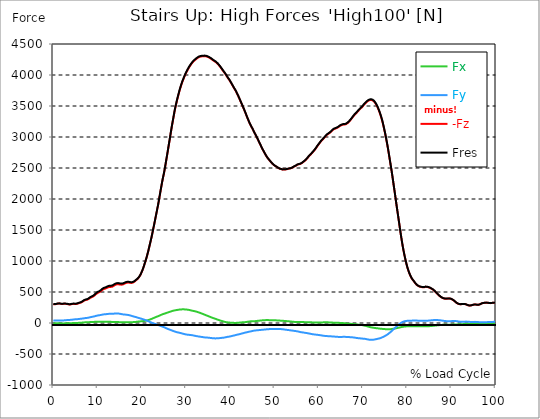
| Category |  Fx |  Fy |  -Fz |  Fres |
|---|---|---|---|---|
| 0.0 | -4.693 | 40.992 | 303.324 | 306.277 |
| 0.16678370786516855 | -5.185 | 40.376 | 303.131 | 306.014 |
| 0.3335674157303371 | -5.326 | 39.99 | 302.621 | 305.469 |
| 0.5003511235955057 | -5.291 | 39.744 | 302.076 | 304.889 |
| 0.6671348314606742 | -5.133 | 40.078 | 305.996 | 308.809 |
| 0.8339185393258427 | -5.221 | 39.779 | 309.547 | 312.324 |
| 1.0007022471910114 | -5.273 | 39.796 | 312.289 | 315.084 |
| 1.1674859550561796 | -5.15 | 40.376 | 313.871 | 316.719 |
| 1.3342696629213484 | -5.08 | 40.833 | 313.959 | 316.859 |
| 1.5010533707865168 | -5.309 | 40.957 | 312.166 | 315.084 |
| 1.6678370786516854 | -5.941 | 40.605 | 309.459 | 312.359 |
| 1.8346207865168538 | -6.644 | 40.025 | 306.611 | 309.476 |
| 2.001404494382023 | -6.75 | 40.007 | 306.277 | 309.16 |
| 2.1681882022471908 | -6.592 | 40.921 | 307.965 | 310.971 |
| 2.334971910112359 | -6.451 | 41.906 | 309.775 | 312.922 |
| 2.501755617977528 | -5.976 | 42.943 | 311.006 | 314.293 |
| 2.668539325842697 | -5.643 | 43.98 | 310.18 | 313.607 |
| 2.8353230337078656 | -5.115 | 45.281 | 309.037 | 312.658 |
| 3.0021067415730336 | -4.535 | 46.722 | 307.209 | 310.971 |
| 3.168890449438202 | -3.674 | 48.638 | 305.926 | 309.951 |
| 3.335674157303371 | -3.586 | 49.042 | 302.937 | 307.086 |
| 3.502457865168539 | -3.762 | 49.13 | 299.229 | 303.412 |
| 3.6692415730337076 | -3.797 | 49.499 | 296.82 | 301.092 |
| 3.8360252808988764 | -3.322 | 50.431 | 298.789 | 303.201 |
| 4.002808988764046 | -2.848 | 51.433 | 302.076 | 306.611 |
| 4.169592696629214 | -2.338 | 52.558 | 305.064 | 309.74 |
| 4.3363764044943816 | -1.775 | 54.07 | 307.262 | 312.148 |
| 4.50316011235955 | -1.213 | 55.599 | 308.316 | 313.449 |
| 4.669943820224718 | -0.791 | 57.603 | 307.613 | 313.133 |
| 4.836727528089888 | -0.387 | 58.904 | 306.365 | 312.183 |
| 5.003511235955056 | 0.018 | 59.818 | 305.434 | 311.463 |
| 5.170294943820225 | 0.422 | 60.837 | 306.506 | 312.693 |
| 5.337078651685394 | 0.826 | 61.277 | 308.439 | 314.68 |
| 5.5038623595505625 | 1.248 | 61.997 | 311.744 | 318.054 |
| 5.670646067415731 | 2.074 | 63.685 | 316.49 | 323.047 |
| 5.837429775280899 | 3.059 | 65.513 | 321.605 | 328.408 |
| 6.004213483146067 | 3.744 | 66.849 | 324.752 | 331.748 |
| 6.170997191011236 | 4.359 | 68.15 | 327.529 | 334.701 |
| 6.329002808988764 | 5.01 | 69.398 | 331.959 | 339.289 |
| 6.495786516853932 | 6.17 | 70.716 | 339.517 | 346.97 |
| 6.662570224719101 | 7.4 | 72.509 | 347.691 | 355.337 |
| 6.82935393258427 | 8.631 | 74.302 | 355.636 | 363.528 |
| 6.9961376404494375 | 9.808 | 76.499 | 362.808 | 371.017 |
| 7.162921348314607 | 10.67 | 78.626 | 368.046 | 376.606 |
| 7.329705056179775 | 11.127 | 80.296 | 371.298 | 380.157 |
| 7.496488764044945 | 11.408 | 81.438 | 373.706 | 382.741 |
| 7.663272471910113 | 11.689 | 82.616 | 376.448 | 385.694 |
| 7.830056179775281 | 12.305 | 84.479 | 381.563 | 391.108 |
| 7.996839887640449 | 13.078 | 86.87 | 388.454 | 398.403 |
| 8.16362359550562 | 13.816 | 89.63 | 396.698 | 407.069 |
| 8.330407303370787 | 15.099 | 93.075 | 405.962 | 416.877 |
| 8.497191011235955 | 15.89 | 95.975 | 412.659 | 424.067 |
| 8.663974719101123 | 16.101 | 98.208 | 417.44 | 429.252 |
| 8.830758426966291 | 16.26 | 100.282 | 421.94 | 434.104 |
| 8.99754213483146 | 16.681 | 102.549 | 427.776 | 440.326 |
| 9.16432584269663 | 17.455 | 104.975 | 435.738 | 448.658 |
| 9.331109550561798 | 18.457 | 108.35 | 446.215 | 459.662 |
| 9.497893258426966 | 19.494 | 112.094 | 457.57 | 471.597 |
| 9.664676966292134 | 20.32 | 115.504 | 468.24 | 482.795 |
| 9.831460674157304 | 20.777 | 118.493 | 477.17 | 492.199 |
| 9.998244382022472 | 21.164 | 121.147 | 484.5 | 499.951 |
| 10.16502808988764 | 21.181 | 122.905 | 489.949 | 505.663 |
| 10.331811797752808 | 20.9 | 124.487 | 495.486 | 511.411 |
| 10.498595505617978 | 20.707 | 126.244 | 501.744 | 517.915 |
| 10.665379213483147 | 20.478 | 128.565 | 510.04 | 526.511 |
| 10.832162921348315 | 20.513 | 131.149 | 519.726 | 536.513 |
| 10.998946629213483 | 20.742 | 133.785 | 530.167 | 547.305 |
| 11.165730337078653 | 21.023 | 136.369 | 539.835 | 557.307 |
| 11.33251404494382 | 21.252 | 138.531 | 546.462 | 564.268 |
| 11.49929775280899 | 21.181 | 140.36 | 551.471 | 569.577 |
| 11.666081460674157 | 20.461 | 141.379 | 553.669 | 571.914 |
| 11.832865168539326 | 19.74 | 142.17 | 556.569 | 574.903 |
| 11.999648876404493 | 19.388 | 143.19 | 562.95 | 581.319 |
| 12.166432584269662 | 19.301 | 144.315 | 569.172 | 587.629 |
| 12.333216292134832 | 19.547 | 145.949 | 574.621 | 593.307 |
| 12.5 | 19.828 | 147.549 | 579.649 | 598.563 |
| 12.66678370786517 | 19.986 | 148.709 | 582.092 | 601.217 |
| 12.833567415730336 | 19.582 | 149.148 | 582.989 | 602.166 |
| 13.000351123595506 | 18.58 | 148.727 | 582.426 | 601.48 |
| 13.167134831460674 | 17.42 | 148.147 | 582.25 | 601.111 |
| 13.333918539325843 | 16.664 | 148.656 | 586.487 | 605.312 |
| 13.500702247191011 | 15.943 | 149.518 | 592.744 | 611.57 |
| 13.667485955056181 | 15.363 | 150.695 | 601.498 | 620.324 |
| 13.834269662921349 | 15.099 | 152.154 | 609.461 | 628.392 |
| 14.001053370786519 | 14.748 | 153.086 | 615.613 | 634.58 |
| 14.167837078651687 | 14.519 | 153.771 | 620.482 | 639.449 |
| 14.334620786516853 | 14.625 | 154.246 | 623.699 | 642.683 |
| 14.501404494382026 | 14.818 | 154.053 | 625.193 | 644.089 |
| 14.668188202247192 | 14.66 | 153.139 | 624.929 | 643.615 |
| 14.834971910112362 | 14.203 | 151.574 | 623.523 | 641.875 |
| 15.001755617977528 | 13.588 | 149.5 | 620.869 | 638.798 |
| 15.168539325842698 | 12.885 | 146.916 | 618.724 | 636.127 |
| 15.335323033707864 | 12.094 | 144.279 | 618.267 | 635.089 |
| 15.502106741573034 | 11.338 | 141.871 | 618.883 | 635.16 |
| 15.6688904494382 | 10.687 | 139.762 | 620.588 | 636.355 |
| 15.83567415730337 | 10.652 | 138.18 | 626.019 | 641.347 |
| 16.00245786516854 | 10.547 | 136.932 | 632.259 | 647.218 |
| 16.16924157303371 | 10.635 | 135.684 | 638.341 | 652.931 |
| 16.336025280898877 | 11.144 | 134.787 | 643.949 | 658.257 |
| 16.502808988764045 | 11.777 | 133.469 | 648.308 | 662.3 |
| 16.669592696629216 | 12.34 | 132.028 | 650.822 | 664.515 |
| 16.83637640449438 | 13.183 | 130.446 | 652.105 | 665.482 |
| 17.003160112359552 | 13.711 | 128.354 | 652.158 | 665.148 |
| 17.169943820224717 | 13.992 | 125.752 | 650.839 | 663.372 |
| 17.336727528089888 | 13.588 | 122.659 | 648.062 | 660.015 |
| 17.503511235955056 | 13.131 | 119.143 | 645.988 | 657.273 |
| 17.670294943820224 | 13.306 | 115.557 | 646.304 | 656.921 |
| 17.837078651685395 | 13.605 | 111.848 | 648.185 | 658.116 |
| 18.003862359550563 | 14.045 | 108.157 | 652.738 | 662.019 |
| 18.17064606741573 | 14.554 | 104.606 | 659.171 | 667.819 |
| 18.3374297752809 | 15.064 | 101.249 | 667.362 | 675.396 |
| 18.504213483146067 | 16.101 | 98.173 | 677.628 | 685.134 |
| 18.662219101123597 | 17.859 | 95.782 | 688.948 | 695.962 |
| 18.829002808988765 | 19.687 | 91.774 | 697.632 | 704.065 |
| 18.995786516853933 | 21.427 | 87.679 | 707.124 | 713.047 |
| 19.1625702247191 | 22.904 | 84.093 | 719.446 | 724.912 |
| 19.32935393258427 | 23.836 | 80.647 | 735.108 | 740.135 |
| 19.49613764044944 | 24.662 | 77.044 | 752.738 | 757.291 |
| 19.662921348314608 | 25.963 | 73.634 | 774.078 | 778.226 |
| 19.829705056179776 | 27.298 | 70.083 | 798.599 | 802.378 |
| 19.996488764044944 | 28.74 | 66.655 | 825.036 | 828.499 |
| 20.163272471910112 | 30.041 | 63.193 | 854.497 | 857.626 |
| 20.33005617977528 | 31.183 | 59.202 | 887.561 | 890.373 |
| 20.49683988764045 | 32.625 | 55.159 | 923.367 | 925.863 |
| 20.663623595505616 | 34.4 | 51.029 | 960.896 | 963.181 |
| 20.830407303370787 | 36.281 | 46.704 | 998.653 | 1000.745 |
| 20.997191011235955 | 38.443 | 42.117 | 1037.307 | 1039.205 |
| 21.163974719101123 | 41.414 | 37.388 | 1080.496 | 1082.289 |
| 21.330758426966295 | 44.525 | 32.519 | 1125.196 | 1126.884 |
| 21.497542134831463 | 47.935 | 27.457 | 1172.006 | 1173.606 |
| 21.66432584269663 | 51.943 | 22.306 | 1221.892 | 1223.51 |
| 21.8311095505618 | 56.32 | 17.068 | 1271.902 | 1273.571 |
| 21.997893258426966 | 60.732 | 11.83 | 1322.192 | 1323.95 |
| 22.164676966292134 | 65.214 | 6.68 | 1374.17 | 1376.015 |
| 22.331460674157306 | 70.101 | 1.758 | 1429.065 | 1431.069 |
| 22.498244382022467 | 75.198 | -2.654 | 1486.703 | 1488.865 |
| 22.66502808988764 | 80.173 | -6.803 | 1545.238 | 1547.611 |
| 22.831811797752806 | 85.2 | -10.617 | 1602.401 | 1604.968 |
| 22.99859550561798 | 90.421 | -14.678 | 1661.691 | 1664.486 |
| 23.165379213483146 | 95.571 | -18.984 | 1722.054 | 1725.042 |
| 23.332162921348313 | 100.44 | -22.939 | 1781.168 | 1784.385 |
| 23.49894662921348 | 104.905 | -27.281 | 1840.705 | 1844.115 |
| 23.665730337078653 | 109.335 | -31.728 | 1899.046 | 1902.667 |
| 23.83251404494382 | 114.379 | -35.929 | 1964.998 | 1968.865 |
| 23.999297752808985 | 119.231 | -40.025 | 2032.989 | 2037.067 |
| 24.166081460674157 | 124.961 | -44.736 | 2102.369 | 2106.746 |
| 24.332865168539325 | 130.217 | -49.271 | 2169.025 | 2173.665 |
| 24.499648876404496 | 135.473 | -53.911 | 2234.907 | 2239.811 |
| 24.666432584269664 | 140.623 | -58.482 | 2299.453 | 2304.656 |
| 24.833216292134832 | 144.578 | -62.823 | 2356.809 | 2362.223 |
| 25.0 | 148.111 | -67.095 | 2410.932 | 2416.574 |
| 25.16678370786517 | 152.084 | -72.439 | 2475.566 | 2481.454 |
| 25.33356741573034 | 156.057 | -77.94 | 2543.03 | 2549.164 |
| 25.500351123595504 | 160.258 | -83.618 | 2613.57 | 2619.968 |
| 25.66713483146067 | 164.301 | -88.874 | 2683.899 | 2690.543 |
| 25.833918539325843 | 168.238 | -93.725 | 2754.632 | 2761.505 |
| 26.00070224719101 | 172.193 | -98.489 | 2826.069 | 2833.188 |
| 26.16748595505618 | 176.236 | -103.27 | 2897.962 | 2905.31 |
| 26.334269662921347 | 180.332 | -107.911 | 2969.962 | 2977.555 |
| 26.50105337078652 | 184.55 | -112.692 | 3043.894 | 3051.716 |
| 26.667837078651687 | 188.593 | -117.034 | 3115.612 | 3123.663 |
| 26.834620786516858 | 192.373 | -121.393 | 3185.554 | 3193.816 |
| 27.001404494382022 | 195.871 | -125.893 | 3252.491 | 3260.946 |
| 27.16818820224719 | 199.228 | -130.358 | 3318.619 | 3327.285 |
| 27.334971910112362 | 202.058 | -134.752 | 3384.501 | 3393.325 |
| 27.50175561797753 | 204.378 | -138.901 | 3447.219 | 3456.184 |
| 27.668539325842698 | 206.54 | -142.943 | 3501.025 | 3510.148 |
| 27.835323033707866 | 208.263 | -146.828 | 3552.493 | 3561.739 |
| 28.002106741573037 | 210.495 | -150.027 | 3601.799 | 3611.168 |
| 28.168890449438205 | 212.587 | -152.312 | 3648.732 | 3658.207 |
| 28.335674157303373 | 214.696 | -154.58 | 3694.751 | 3704.313 |
| 28.502457865168537 | 216.841 | -157.322 | 3739.17 | 3748.873 |
| 28.669241573033705 | 218.405 | -160.328 | 3780.637 | 3790.445 |
| 28.836025280898877 | 219.144 | -163.404 | 3818.798 | 3828.677 |
| 29.002808988764052 | 219.601 | -166.48 | 3855.501 | 3865.468 |
| 29.169592696629213 | 220.216 | -169.943 | 3890.024 | 3900.078 |
| 29.336376404494384 | 220.409 | -173.283 | 3921.189 | 3931.314 |
| 29.50316011235955 | 219.917 | -176.148 | 3949.631 | 3959.791 |
| 29.669943820224724 | 219.618 | -179.418 | 3979.302 | 3989.515 |
| 29.836727528089884 | 219.284 | -182.494 | 4007.391 | 4017.657 |
| 30.003511235955056 | 218.265 | -184.691 | 4032.721 | 4042.987 |
| 30.170294943820224 | 216.472 | -186.537 | 4055.643 | 4065.838 |
| 30.337078651685395 | 214.855 | -188.417 | 4078.16 | 4088.32 |
| 30.503862359550563 | 213.431 | -189.683 | 4099.974 | 4110.064 |
| 30.670646067415728 | 211.093 | -190.949 | 4121.138 | 4131.14 |
| 30.837429775280903 | 208.157 | -192.144 | 4140.333 | 4150.194 |
| 30.99543539325843 | 205.257 | -193.568 | 4158.263 | 4168.001 |
| 31.162219101123597 | 202.392 | -195.08 | 4175.208 | 4184.858 |
| 31.32900280898876 | 199.509 | -196.609 | 4191.362 | 4200.907 |
| 31.495786516853936 | 196.837 | -198.525 | 4206.285 | 4215.777 |
| 31.6625702247191 | 194.306 | -200.88 | 4219.451 | 4228.908 |
| 31.82935393258427 | 191.968 | -203.658 | 4230.824 | 4240.299 |
| 31.996137640449433 | 189.56 | -206.365 | 4241.301 | 4250.81 |
| 32.162921348314605 | 186.501 | -209.036 | 4250.968 | 4260.46 |
| 32.329705056179776 | 183.197 | -211.304 | 4260.425 | 4269.882 |
| 32.49648876404494 | 179.857 | -213.501 | 4269.9 | 4279.304 |
| 32.66327247191011 | 176.007 | -215.47 | 4278.917 | 4288.234 |
| 32.83005617977528 | 171.367 | -216.999 | 4285.825 | 4295.036 |
| 32.996839887640455 | 167.306 | -218.968 | 4291.415 | 4300.556 |
| 33.16362359550562 | 163.334 | -221.271 | 4295.194 | 4304.3 |
| 33.330407303370784 | 158.869 | -222.73 | 4297.866 | 4306.884 |
| 33.497191011235955 | 154.193 | -223.819 | 4300.169 | 4309.063 |
| 33.66397471910113 | 149.377 | -226.017 | 4301.61 | 4310.47 |
| 33.83075842696629 | 144.525 | -228.231 | 4302.858 | 4311.718 |
| 33.997542134831455 | 139.727 | -230.165 | 4303.649 | 4312.438 |
| 34.164325842696634 | 134.998 | -232.186 | 4304.001 | 4312.755 |
| 34.3311095505618 | 130.34 | -233.364 | 4303.632 | 4312.298 |
| 34.49789325842697 | 125.647 | -234.015 | 4301.628 | 4310.206 |
| 34.66467696629213 | 121.164 | -235.368 | 4298.042 | 4306.567 |
| 34.831460674157306 | 116.436 | -235.86 | 4294.175 | 4302.56 |
| 34.99824438202247 | 111.374 | -236.124 | 4289.218 | 4297.497 |
| 35.16502808988764 | 106.962 | -237.249 | 4283.523 | 4291.767 |
| 35.331811797752806 | 102.233 | -239.059 | 4276.913 | 4285.157 |
| 35.49859550561798 | 97.891 | -240.764 | 4269.302 | 4277.546 |
| 35.66537921348315 | 92.6 | -242.399 | 4261.269 | 4269.513 |
| 35.83216292134831 | 87.52 | -243.805 | 4252.779 | 4261.005 |
| 35.998946629213485 | 83.214 | -245.721 | 4242.97 | 4251.285 |
| 36.16573033707865 | 79.101 | -246.864 | 4233.883 | 4242.197 |
| 36.33251404494382 | 74.917 | -247.567 | 4226.676 | 4234.973 |
| 36.499297752808985 | 70.857 | -248.077 | 4219.768 | 4228.029 |
| 36.666081460674164 | 66.972 | -248.376 | 4211.875 | 4220.102 |
| 36.83286516853932 | 62.911 | -247.901 | 4201.908 | 4210.082 |
| 36.99964887640449 | 57.989 | -246.811 | 4191.239 | 4199.289 |
| 37.166432584269664 | 53.894 | -246.055 | 4179.813 | 4187.793 |
| 37.333216292134836 | 49.728 | -245.071 | 4166.542 | 4174.434 |
| 37.5 | 45.667 | -244.456 | 4151.97 | 4159.809 |
| 37.666783707865164 | 41.29 | -243.524 | 4136.976 | 4144.728 |
| 37.833567415730336 | 37.599 | -241.837 | 4121.103 | 4128.749 |
| 38.00035112359551 | 34.294 | -240.343 | 4104.738 | 4112.296 |
| 38.16713483146068 | 30.867 | -239.077 | 4087.617 | 4095.088 |
| 38.333918539325836 | 27.246 | -237.917 | 4071.041 | 4078.441 |
| 38.50070224719101 | 23.203 | -236.845 | 4054.588 | 4061.918 |
| 38.66748595505618 | 19.617 | -234.893 | 4038.504 | 4045.746 |
| 38.83426966292135 | 16.172 | -232.433 | 4023.141 | 4030.26 |
| 39.001053370786515 | 13.887 | -229.69 | 4004.931 | 4011.909 |
| 39.16783707865169 | 11.619 | -226.474 | 3986.087 | 3992.907 |
| 39.33462078651686 | 10.705 | -224.101 | 3965.978 | 3972.693 |
| 39.50140449438202 | 9.088 | -222.29 | 3948.242 | 3954.886 |
| 39.668188202247194 | 7.523 | -220.849 | 3932.035 | 3938.627 |
| 39.83497191011236 | 6.275 | -218.95 | 3914.58 | 3921.102 |
| 40.00175561797753 | 5.572 | -216.278 | 3895.016 | 3901.432 |
| 40.168539325842694 | 5.08 | -213.818 | 3874.239 | 3880.549 |
| 40.335323033707866 | 4.201 | -210.284 | 3853.849 | 3860.018 |
| 40.50210674157304 | 3.234 | -207.243 | 3832.597 | 3838.626 |
| 40.6688904494382 | 2.373 | -204.659 | 3811.609 | 3817.533 |
| 40.83567415730337 | 1.881 | -202.128 | 3790.48 | 3796.281 |
| 41.00245786516854 | 1.67 | -199.158 | 3770.811 | 3776.488 |
| 41.16924157303371 | 1.705 | -195.941 | 3752.319 | 3757.856 |
| 41.33602528089887 | 1.986 | -192.39 | 3729.555 | 3734.916 |
| 41.502808988764045 | 2.478 | -189.349 | 3705.052 | 3710.29 |
| 41.669592696629216 | 2.865 | -186.871 | 3680.284 | 3685.435 |
| 41.83637640449439 | 3.621 | -184.252 | 3655.253 | 3660.298 |
| 42.00316011235955 | 5.309 | -181.369 | 3628.342 | 3633.299 |
| 42.16994382022472 | 7.154 | -178.433 | 3601.184 | 3606.018 |
| 42.33672752808989 | 8.754 | -175.304 | 3573.587 | 3578.297 |
| 42.50351123595506 | 9.721 | -171.982 | 3546.112 | 3550.683 |
| 42.670294943820224 | 10.265 | -168.502 | 3518.919 | 3523.349 |
| 42.83707865168539 | 10.705 | -165.162 | 3491.955 | 3496.261 |
| 43.00386235955057 | 11.285 | -162.174 | 3463.672 | 3467.873 |
| 43.17064606741573 | 11.918 | -159.062 | 3434.915 | 3438.993 |
| 43.32865168539326 | 13.113 | -156.109 | 3405.63 | 3409.602 |
| 43.495435393258425 | 14.73 | -153.244 | 3375.923 | 3379.808 |
| 43.6622191011236 | 16.945 | -150.432 | 3344.652 | 3348.431 |
| 43.82900280898876 | 19.213 | -147.654 | 3314.787 | 3318.496 |
| 43.99578651685393 | 21.041 | -144.772 | 3285.819 | 3289.422 |
| 44.162570224719104 | 22.5 | -141.889 | 3257.29 | 3260.823 |
| 44.32935393258427 | 24.152 | -139.358 | 3229.306 | 3232.769 |
| 44.49613764044944 | 26.209 | -136.932 | 3202.992 | 3206.402 |
| 44.66292134831461 | 27.615 | -134.594 | 3179.349 | 3182.707 |
| 44.82970505617978 | 28.107 | -131.905 | 3158.291 | 3161.578 |
| 44.99648876404493 | 28.125 | -128.881 | 3136.407 | 3139.588 |
| 45.16327247191011 | 28.494 | -126.157 | 3112.026 | 3115.12 |
| 45.33005617977528 | 28.81 | -123.889 | 3087.733 | 3090.757 |
| 45.49683988764045 | 29.179 | -121.903 | 3063.986 | 3066.956 |
| 45.66362359550561 | 30.129 | -120.321 | 3041.047 | 3044 |
| 45.83040730337079 | 31.675 | -119.161 | 3018.617 | 3021.57 |
| 45.99719101123596 | 33.257 | -118.106 | 2994.887 | 2997.84 |
| 46.16397471910113 | 34.804 | -117.122 | 2970.208 | 2973.178 |
| 46.33075842696629 | 36 | -115.786 | 2945.546 | 2948.499 |
| 46.497542134831455 | 37.23 | -114.696 | 2921.042 | 2923.96 |
| 46.66432584269663 | 38.531 | -113.448 | 2896.205 | 2899.123 |
| 46.83110955056179 | 39.884 | -112.34 | 2871.437 | 2874.338 |
| 46.99789325842696 | 41.326 | -110.987 | 2845.598 | 2848.481 |
| 47.164676966292134 | 42.31 | -109.581 | 2821.094 | 2823.942 |
| 47.331460674157306 | 43.154 | -107.999 | 2797.856 | 2800.669 |
| 47.49824438202247 | 43.98 | -107.12 | 2775.48 | 2778.257 |
| 47.66502808988764 | 44.999 | -106.346 | 2753.736 | 2756.513 |
| 47.83181179775281 | 45.861 | -105.063 | 2732.238 | 2734.998 |
| 47.99859550561797 | 46.581 | -103.639 | 2710.74 | 2713.465 |
| 48.16537921348314 | 47.038 | -102.462 | 2690.912 | 2693.602 |
| 48.33216292134831 | 47.038 | -101.301 | 2672.965 | 2675.62 |
| 48.498946629213485 | 46.74 | -100.194 | 2656.302 | 2658.921 |
| 48.66573033707865 | 46.423 | -99.438 | 2641.554 | 2644.138 |
| 48.83251404494382 | 46.247 | -98.753 | 2627.087 | 2629.653 |
| 48.99929775280899 | 45.949 | -97.751 | 2612.111 | 2614.642 |
| 49.166081460674164 | 45.79 | -97.346 | 2598.505 | 2601.019 |
| 49.33286516853933 | 46.072 | -97.153 | 2584.689 | 2587.203 |
| 49.499648876404486 | 46.124 | -97.065 | 2571.787 | 2574.318 |
| 49.666432584269664 | 46.019 | -96.942 | 2560.432 | 2562.963 |
| 49.83321629213483 | 45.913 | -96.714 | 2549.375 | 2551.889 |
| 50.0 | 45.369 | -96.397 | 2539.496 | 2542.01 |
| 50.166783707865164 | 44.05 | -95.923 | 2532.254 | 2534.698 |
| 50.33356741573034 | 42.714 | -95.659 | 2525.487 | 2527.877 |
| 50.50035112359551 | 41.994 | -96.01 | 2518.385 | 2520.758 |
| 50.66713483146068 | 41.66 | -96.432 | 2509.684 | 2512.092 |
| 50.83391853932584 | 41.203 | -96.977 | 2502.056 | 2504.481 |
| 51.00070224719101 | 40.57 | -97.048 | 2494.093 | 2496.518 |
| 51.16748595505618 | 39.111 | -97.048 | 2489.101 | 2491.509 |
| 51.33426966292134 | 37.898 | -97.663 | 2486.007 | 2488.415 |
| 51.50105337078652 | 37.019 | -98.366 | 2482.28 | 2484.706 |
| 51.66783707865169 | 36.474 | -99.473 | 2478.448 | 2480.927 |
| 51.83462078651686 | 35.841 | -100.633 | 2475.056 | 2477.569 |
| 52.00140449438202 | 34.628 | -102.11 | 2474.968 | 2477.534 |
| 52.168188202247194 | 33.328 | -103.868 | 2476.04 | 2478.659 |
| 52.33497191011236 | 32.765 | -105.907 | 2476.603 | 2479.327 |
| 52.50175561797752 | 32.255 | -107.963 | 2477.148 | 2479.96 |
| 52.668539325842694 | 30.849 | -109.616 | 2478.765 | 2481.63 |
| 52.835323033707866 | 28.705 | -110.846 | 2481.525 | 2484.425 |
| 53.00210674157304 | 27.703 | -112.34 | 2485.269 | 2488.222 |
| 53.1688904494382 | 26.859 | -113.87 | 2489.048 | 2492.054 |
| 53.33567415730337 | 26.595 | -115.469 | 2491.386 | 2494.479 |
| 53.502457865168545 | 25.927 | -117.297 | 2492.089 | 2495.27 |
| 53.669241573033716 | 24.802 | -119.108 | 2493.759 | 2497.011 |
| 53.83602528089887 | 22.517 | -120.426 | 2499.208 | 2502.513 |
| 54.002808988764045 | 20.97 | -121.955 | 2505.835 | 2509.21 |
| 54.169592696629216 | 19.81 | -123.696 | 2512.514 | 2515.977 |
| 54.33637640449438 | 19.177 | -125.717 | 2519.422 | 2522.991 |
| 54.50316011235955 | 17.912 | -127.616 | 2525.346 | 2529.002 |
| 54.669943820224724 | 16.383 | -129.285 | 2530.707 | 2534.434 |
| 54.836727528089895 | 15.31 | -130.78 | 2537.088 | 2540.885 |
| 55.00351123595506 | 14.431 | -132.291 | 2544.963 | 2548.813 |
| 55.17029494382022 | 15.117 | -134.576 | 2552.908 | 2556.881 |
| 55.337078651685395 | 15.697 | -137.09 | 2557.742 | 2561.856 |
| 55.50386235955056 | 16.154 | -139.762 | 2560.186 | 2564.439 |
| 55.66186797752809 | 16.137 | -142.609 | 2562.77 | 2567.182 |
| 55.82865168539326 | 16.049 | -145.774 | 2565.617 | 2570.205 |
| 55.995435393258425 | 15.679 | -148.322 | 2570.574 | 2575.285 |
| 56.1622191011236 | 15.082 | -150.168 | 2578.502 | 2583.301 |
| 56.32900280898877 | 14.484 | -151.521 | 2587.326 | 2592.177 |
| 56.49578651685393 | 14.326 | -153.174 | 2596.519 | 2601.459 |
| 56.6625702247191 | 14.484 | -155.301 | 2605.589 | 2610.634 |
| 56.82935393258427 | 13.746 | -157.41 | 2615.011 | 2620.161 |
| 56.99613764044943 | 12.392 | -159.291 | 2625.206 | 2630.444 |
| 57.16292134831461 | 11.144 | -160.803 | 2637.159 | 2642.468 |
| 57.329705056179776 | 10.353 | -162.683 | 2650.097 | 2655.511 |
| 57.49648876404495 | 10.09 | -164.916 | 2665.196 | 2670.733 |
| 57.66327247191011 | 10.23 | -167.553 | 2680.77 | 2686.465 |
| 57.83005617977529 | 9.808 | -169.943 | 2694.586 | 2700.404 |
| 57.99683988764044 | 10.019 | -172.07 | 2706.451 | 2712.375 |
| 58.16362359550561 | 10.336 | -174.636 | 2717.719 | 2723.766 |
| 58.33040730337079 | 10.67 | -177.203 | 2728.969 | 2735.174 |
| 58.497191011235955 | 9.984 | -179.47 | 2742.785 | 2749.113 |
| 58.66397471910112 | 9.264 | -181.439 | 2755.582 | 2762.015 |
| 58.83075842696629 | 8.719 | -183.144 | 2770.206 | 2776.728 |
| 58.99754213483147 | 8.051 | -184.884 | 2784.005 | 2790.614 |
| 59.164325842696634 | 7.383 | -186.537 | 2798.331 | 2805.011 |
| 59.33110955056179 | 7.172 | -187.503 | 2815.399 | 2822.096 |
| 59.49789325842697 | 6.961 | -188.892 | 2832.063 | 2838.795 |
| 59.664676966292134 | 6.996 | -189.947 | 2850.309 | 2857.059 |
| 59.8314606741573 | 6.803 | -191.582 | 2866.516 | 2873.301 |
| 59.99824438202247 | 6.908 | -193.603 | 2882.406 | 2889.279 |
| 60.16502808988765 | 7.172 | -195.501 | 2898.191 | 2905.134 |
| 60.33181179775281 | 7.664 | -196.995 | 2914.029 | 2921.025 |
| 60.49859550561798 | 8.226 | -198.63 | 2929.532 | 2936.581 |
| 60.66537921348315 | 8.859 | -200.441 | 2944.052 | 2951.171 |
| 60.83216292134831 | 9.861 | -202.937 | 2955.987 | 2963.212 |
| 60.99894662921348 | 10.213 | -205.31 | 2967.94 | 2975.288 |
| 61.16573033707864 | 10.441 | -206.874 | 2980.86 | 2988.243 |
| 61.33251404494383 | 10.67 | -207.911 | 2994.377 | 3001.795 |
| 61.49929775280899 | 10.758 | -208.773 | 3008.246 | 3015.682 |
| 61.66608146067416 | 10.846 | -209.599 | 3021.975 | 3029.428 |
| 61.83286516853932 | 10.81 | -210.566 | 3034.578 | 3042.066 |
| 61.99964887640451 | 10.617 | -211.831 | 3043.595 | 3051.136 |
| 62.16643258426967 | 10.301 | -213.167 | 3050.978 | 3058.572 |
| 62.33321629213482 | 9.545 | -213.87 | 3059.046 | 3066.658 |
| 62.5 | 8.859 | -214.38 | 3067.677 | 3075.288 |
| 62.66678370786517 | 8.209 | -214.819 | 3076.923 | 3084.552 |
| 62.833567415730336 | 7.453 | -215.417 | 3088.208 | 3095.837 |
| 63.0003511235955 | 6.539 | -216.155 | 3101.339 | 3108.985 |
| 63.16713483146068 | 5.853 | -217.228 | 3114.083 | 3121.782 |
| 63.33391853932585 | 5.379 | -218.458 | 3121.465 | 3129.217 |
| 63.500702247191015 | 4.904 | -219.39 | 3128.725 | 3136.512 |
| 63.66748595505618 | 4.781 | -219.882 | 3133.26 | 3141.082 |
| 63.83426966292135 | 4.711 | -220.48 | 3138.094 | 3145.951 |
| 64.00105337078651 | 4.307 | -221.411 | 3142.559 | 3150.451 |
| 64.16783707865169 | 3.656 | -222.571 | 3147.41 | 3155.373 |
| 64.33462078651687 | 2.971 | -223.696 | 3154.125 | 3162.141 |
| 64.50140449438203 | 2.478 | -224.522 | 3162.422 | 3170.49 |
| 64.6681882022472 | 2.004 | -225.05 | 3171.422 | 3179.49 |
| 64.83497191011236 | 1.635 | -225.384 | 3180.228 | 3188.314 |
| 65.00175561797754 | 1.195 | -225.524 | 3187.734 | 3195.802 |
| 65.16853932584269 | -0.316 | -224.892 | 3192.55 | 3200.566 |
| 65.33532303370787 | -1.758 | -223.96 | 3196.259 | 3204.205 |
| 65.50210674157304 | -2.953 | -222.905 | 3199.652 | 3207.509 |
| 65.66889044943821 | -2.127 | -222.73 | 3200.812 | 3208.634 |
| 65.83567415730337 | -0.949 | -223.116 | 3201.252 | 3209.109 |
| 66.00245786516854 | -2.566 | -223.679 | 3203.783 | 3211.675 |
| 66.1692415730337 | -4.57 | -224.153 | 3207.632 | 3215.56 |
| 66.33602528089888 | -7.207 | -224.487 | 3214.47 | 3222.415 |
| 66.50280898876404 | -9.387 | -225.243 | 3223.699 | 3231.679 |
| 66.66959269662921 | -11.637 | -226.649 | 3232.962 | 3241.03 |
| 66.83637640449439 | -12.322 | -227.054 | 3245.056 | 3253.106 |
| 67.00316011235955 | -12.656 | -227.897 | 3258.432 | 3266.536 |
| 67.16994382022472 | -13.096 | -228.161 | 3272.706 | 3280.774 |
| 67.33672752808988 | -13.64 | -228.267 | 3287.19 | 3295.241 |
| 67.50351123595506 | -14.836 | -229.638 | 3302.114 | 3310.234 |
| 67.67029494382022 | -16.523 | -231.835 | 3316.844 | 3325.088 |
| 67.83707865168539 | -17.912 | -232.696 | 3334.07 | 3342.367 |
| 67.99508426966291 | -18.334 | -234.155 | 3349.504 | 3357.871 |
| 68.16186797752809 | -18.808 | -236.054 | 3363.144 | 3371.617 |
| 68.32865168539327 | -20.144 | -238.514 | 3374.06 | 3382.673 |
| 68.49543539325843 | -21.551 | -240.712 | 3385.714 | 3394.468 |
| 68.6622191011236 | -23.361 | -241.925 | 3400.181 | 3409.005 |
| 68.82900280898876 | -26.05 | -243.876 | 3413.118 | 3422.083 |
| 68.99578651685394 | -27.193 | -245.423 | 3426.02 | 3435.073 |
| 69.1625702247191 | -27.72 | -246.214 | 3439.168 | 3448.274 |
| 69.32935393258425 | -29.32 | -247.216 | 3451.438 | 3460.596 |
| 69.49613764044945 | -30.304 | -248.78 | 3463.391 | 3472.654 |
| 69.66292134831461 | -31.166 | -250.169 | 3473.217 | 3482.568 |
| 69.82970505617978 | -32.414 | -251.575 | 3484.361 | 3493.783 |
| 69.99648876404494 | -35.841 | -252.594 | 3499.689 | 3509.164 |
| 70.16327247191012 | -39.884 | -253.421 | 3515.755 | 3525.265 |
| 70.33005617977528 | -42.82 | -254.282 | 3529.466 | 3539.028 |
| 70.49683988764045 | -45.017 | -255.301 | 3541.489 | 3551.104 |
| 70.66362359550561 | -47.39 | -257.674 | 3552.722 | 3562.477 |
| 70.83040730337079 | -50.589 | -260.891 | 3564.516 | 3574.483 |
| 70.99719101123596 | -53.841 | -263.862 | 3574.624 | 3584.801 |
| 71.16397471910112 | -57.198 | -266.551 | 3582.956 | 3593.344 |
| 71.3307584269663 | -60.714 | -268.327 | 3589.565 | 3600.129 |
| 71.49754213483146 | -64.423 | -269.205 | 3594.504 | 3605.174 |
| 71.66432584269663 | -67.851 | -269.926 | 3598.494 | 3609.27 |
| 71.83110955056179 | -70.224 | -270.084 | 3598.653 | 3609.481 |
| 71.99789325842697 | -72.228 | -270.471 | 3596.104 | 3607.002 |
| 72.16467696629215 | -74.372 | -270.612 | 3591.393 | 3602.362 |
| 72.3314606741573 | -76.218 | -269.469 | 3583.641 | 3594.575 |
| 72.49824438202248 | -78.134 | -267.694 | 3573.006 | 3583.887 |
| 72.66502808988764 | -79.997 | -265.778 | 3559.805 | 3570.633 |
| 72.8318117977528 | -81.72 | -263.422 | 3542.579 | 3553.319 |
| 72.99859550561797 | -83.337 | -260.698 | 3522.786 | 3533.421 |
| 73.16537921348315 | -84.638 | -257.569 | 3499.918 | 3510.429 |
| 73.33216292134833 | -85.991 | -254.598 | 3473.814 | 3484.221 |
| 73.49894662921349 | -87.731 | -252.208 | 3444.723 | 3455.076 |
| 73.66573033707864 | -89.542 | -249.694 | 3414.63 | 3424.948 |
| 73.83251404494382 | -91.405 | -246.548 | 3382.462 | 3392.692 |
| 73.99929775280899 | -92.829 | -242.276 | 3346.287 | 3356.359 |
| 74.16608146067415 | -93.848 | -237.302 | 3307.44 | 3317.301 |
| 74.33286516853933 | -94.692 | -231.958 | 3265.358 | 3274.991 |
| 74.49964887640449 | -95.29 | -226.263 | 3218.372 | 3227.759 |
| 74.66643258426967 | -96.327 | -220.532 | 3167.203 | 3176.379 |
| 74.83321629213484 | -97.434 | -214.661 | 3114.118 | 3123.065 |
| 75.0 | -98.735 | -208.316 | 3058.273 | 3067.009 |
| 75.16678370786516 | -99.93 | -201.671 | 2999.739 | 3008.229 |
| 75.33356741573033 | -101.178 | -194.622 | 2938.005 | 2946.249 |
| 75.5003511235955 | -102.163 | -187.222 | 2874.18 | 2882.16 |
| 75.66713483146067 | -102.444 | -178.855 | 2806.786 | 2814.415 |
| 75.83391853932585 | -101.846 | -169.275 | 2734.892 | 2742.099 |
| 76.00070224719101 | -100.95 | -159.291 | 2661.803 | 2668.571 |
| 76.16748595505618 | -99.878 | -149.623 | 2588.521 | 2594.884 |
| 76.33426966292136 | -98.753 | -140.043 | 2515.643 | 2521.567 |
| 76.50105337078652 | -97.206 | -129.655 | 2439.882 | 2445.367 |
| 76.66783707865167 | -95.483 | -118.739 | 2361.046 | 2366.055 |
| 76.83462078651685 | -93.69 | -107.577 | 2279.467 | 2284.054 |
| 77.00140449438202 | -91.528 | -95.958 | 2196.288 | 2200.436 |
| 77.1681882022472 | -89.401 | -84.497 | 2114.586 | 2118.26 |
| 77.33497191011236 | -87.116 | -73.528 | 2031.038 | 2034.378 |
| 77.50175561797754 | -84.743 | -62.525 | 1946.717 | 1949.723 |
| 77.6685393258427 | -82.352 | -51.697 | 1863.732 | 1866.404 |
| 77.83532303370787 | -80.015 | -41.273 | 1782.645 | 1785.071 |
| 78.00210674157303 | -77.483 | -31.341 | 1701.628 | 1703.861 |
| 78.1688904494382 | -74.812 | -21.674 | 1620.665 | 1622.721 |
| 78.33567415730337 | -72.105 | -11.935 | 1538.207 | 1540.105 |
| 78.50245786516854 | -69.099 | -3.129 | 1457.26 | 1459.089 |
| 78.66924157303372 | -66.198 | 4.851 | 1379.197 | 1380.99 |
| 78.83602528089888 | -63.79 | 11.812 | 1305.159 | 1306.934 |
| 79.00280898876404 | -61.716 | 17.806 | 1234.812 | 1236.605 |
| 79.16959269662921 | -59.782 | 22.342 | 1170.618 | 1172.481 |
| 79.33637640449439 | -57.989 | 26.191 | 1110.273 | 1112.224 |
| 79.50316011235955 | -56.425 | 29.285 | 1054.885 | 1056.924 |
| 79.66994382022472 | -55.036 | 31.289 | 1002.925 | 1005.051 |
| 79.8367275280899 | -53.753 | 33.134 | 952.898 | 955.113 |
| 80.00351123595506 | -52.857 | 34.839 | 907.512 | 909.867 |
| 80.17029494382022 | -52.417 | 36.386 | 867.786 | 870.282 |
| 80.32830056179776 | -52.224 | 37.283 | 832.384 | 835.02 |
| 80.49508426966293 | -52.224 | 37.669 | 799.988 | 802.73 |
| 80.66186797752809 | -52.382 | 37.845 | 771.828 | 774.676 |
| 80.82865168539325 | -52.382 | 38.056 | 746.059 | 748.994 |
| 80.99543539325842 | -52.505 | 38.003 | 723.366 | 726.371 |
| 81.1622191011236 | -52.857 | 38.003 | 704.153 | 707.264 |
| 81.32900280898878 | -53.437 | 38.759 | 689.405 | 692.657 |
| 81.49578651685394 | -53.507 | 40.165 | 674.657 | 678.067 |
| 81.6625702247191 | -52.857 | 40.675 | 657.993 | 661.509 |
| 81.82935393258427 | -52.505 | 40.306 | 641.189 | 644.757 |
| 81.99613764044945 | -52.611 | 39.55 | 626.23 | 629.834 |
| 82.16292134831461 | -52.54 | 38.742 | 614.857 | 618.461 |
| 82.32970505617978 | -52.259 | 38.197 | 605.506 | 609.074 |
| 82.49648876404494 | -52.189 | 38.46 | 597.982 | 601.586 |
| 82.66327247191012 | -52.382 | 38.197 | 591.672 | 595.293 |
| 82.83005617977528 | -52.699 | 37.599 | 586.346 | 589.985 |
| 82.99683988764045 | -53.103 | 36.404 | 582.391 | 586.012 |
| 83.16362359550563 | -53.437 | 36.158 | 581.143 | 584.781 |
| 83.33040730337079 | -53.49 | 36.773 | 580.457 | 584.149 |
| 83.49719101123596 | -52.663 | 36.597 | 575.553 | 579.157 |
| 83.66397471910112 | -52.681 | 36.281 | 574.534 | 578.137 |
| 83.8307584269663 | -52.435 | 36.017 | 575.412 | 578.963 |
| 83.99754213483146 | -52.488 | 36.228 | 579.842 | 583.41 |
| 84.16432584269663 | -52.488 | 36.667 | 583.533 | 587.084 |
| 84.33110955056179 | -51.995 | 37.353 | 582.883 | 586.451 |
| 84.49789325842697 | -51.697 | 37.634 | 581.67 | 585.239 |
| 84.66467696629213 | -51.591 | 37.757 | 580.088 | 583.674 |
| 84.8314606741573 | -51.257 | 38.601 | 576.45 | 580.088 |
| 84.99824438202248 | -50.818 | 39.761 | 571.44 | 575.149 |
| 85.16502808988764 | -50.044 | 40.798 | 566.184 | 569.928 |
| 85.3318117977528 | -49.148 | 42.257 | 560.049 | 563.881 |
| 85.49859550561797 | -48.093 | 43.91 | 553.124 | 557.044 |
| 85.66537921348315 | -46.898 | 44.806 | 546.128 | 550.065 |
| 85.83216292134831 | -45.667 | 45.755 | 538.534 | 542.489 |
| 85.99894662921348 | -44.402 | 46.81 | 529.376 | 533.384 |
| 86.16573033707866 | -42.996 | 47.337 | 518.829 | 522.855 |
| 86.33251404494384 | -41.519 | 47.742 | 507.228 | 511.288 |
| 86.499297752809 | -40.007 | 48.058 | 493.57 | 497.683 |
| 86.66608146067415 | -38.601 | 48.023 | 479.806 | 483.955 |
| 86.83286516853933 | -37.388 | 47.197 | 468.943 | 472.968 |
| 86.99964887640449 | -36.246 | 46.564 | 457.711 | 461.683 |
| 87.16643258426966 | -35.209 | 45.579 | 445.389 | 449.291 |
| 87.33321629213482 | -34.136 | 44.208 | 434.772 | 438.533 |
| 87.5 | -32.836 | 42.89 | 425.508 | 429.094 |
| 87.66678370786518 | -31.429 | 41.466 | 416.772 | 420.164 |
| 87.83356741573033 | -30.269 | 39.55 | 409.442 | 412.624 |
| 88.00035112359551 | -29.408 | 37.757 | 403.501 | 406.471 |
| 88.16713483146067 | -28.757 | 35.595 | 399.018 | 401.76 |
| 88.33391853932584 | -28.142 | 34.154 | 394.993 | 397.559 |
| 88.500702247191 | -27.773 | 32.255 | 392.796 | 395.186 |
| 88.66748595505618 | -27.597 | 30.849 | 391.917 | 394.184 |
| 88.83426966292136 | -27.545 | 30.058 | 391.53 | 393.727 |
| 89.00105337078652 | -27.228 | 29.285 | 392.11 | 394.22 |
| 89.16783707865169 | -27.211 | 28.705 | 393.376 | 395.45 |
| 89.33462078651687 | -27.281 | 28.125 | 394.782 | 396.803 |
| 89.50140449438203 | -27.58 | 28.177 | 394.729 | 396.768 |
| 89.6681882022472 | -27.773 | 28.617 | 393.604 | 395.696 |
| 89.83497191011236 | -27.808 | 29.338 | 390.897 | 393.042 |
| 90.00175561797754 | -27.298 | 30.146 | 385.641 | 387.856 |
| 90.16853932584269 | -26.578 | 30.814 | 379.753 | 382.003 |
| 90.33532303370787 | -25.875 | 31.429 | 373.249 | 375.534 |
| 90.50210674157303 | -25.259 | 31.939 | 365.743 | 368.081 |
| 90.6688904494382 | -24.75 | 32.009 | 356.04 | 358.413 |
| 90.83567415730336 | -24.381 | 31.746 | 344.72 | 347.093 |
| 91.00245786516854 | -23.8 | 31.166 | 333.453 | 335.826 |
| 91.1692415730337 | -23.326 | 29.988 | 324.312 | 326.615 |
| 91.33602528089888 | -22.904 | 27.738 | 317.562 | 319.707 |
| 91.50280898876404 | -22.465 | 25.47 | 310.971 | 312.922 |
| 91.66959269662922 | -21.937 | 23.326 | 306.277 | 308.053 |
| 91.83637640449439 | -21.392 | 21.533 | 303.816 | 305.451 |
| 92.00316011235955 | -20.812 | 20.162 | 302.322 | 303.816 |
| 92.16994382022472 | -20.144 | 19.599 | 302.27 | 303.693 |
| 92.3367275280899 | -19.318 | 19.652 | 304.449 | 305.803 |
| 92.50351123595506 | -18.369 | 19.898 | 306.98 | 308.316 |
| 92.66151685393258 | -17.648 | 20.689 | 307.033 | 308.422 |
| 92.82830056179776 | -16.91 | 21.463 | 306.435 | 307.859 |
| 92.99508426966291 | -16.26 | 21.849 | 305.416 | 306.822 |
| 93.16186797752809 | -15.785 | 22.218 | 303.219 | 304.643 |
| 93.32865168539325 | -15.486 | 22.447 | 299.457 | 300.898 |
| 93.49543539325842 | -15.17 | 21.832 | 294.289 | 295.695 |
| 93.66221910112358 | -14.994 | 21.181 | 288.436 | 289.807 |
| 93.82900280898876 | -14.853 | 19.951 | 284.112 | 285.395 |
| 93.99578651685393 | -14.502 | 18.738 | 282.283 | 283.514 |
| 94.1625702247191 | -14.097 | 17.912 | 281.809 | 282.969 |
| 94.32935393258427 | -13.781 | 17.103 | 282.336 | 283.426 |
| 94.49613764044945 | -13.482 | 16.453 | 284.621 | 285.641 |
| 94.66292134831461 | -12.99 | 15.926 | 287.838 | 288.77 |
| 94.82970505617978 | -12.34 | 16.435 | 292.004 | 292.953 |
| 94.99648876404494 | -11.689 | 17.332 | 295.836 | 296.838 |
| 95.16327247191012 | -10.951 | 17.736 | 297.945 | 298.947 |
| 95.33005617977528 | -10.635 | 18.176 | 298.121 | 299.141 |
| 95.49683988764046 | -10.389 | 18.176 | 297.893 | 298.912 |
| 95.66362359550563 | -10.582 | 17.842 | 295.766 | 296.768 |
| 95.83040730337078 | -10.933 | 16.804 | 293.041 | 293.99 |
| 95.99719101123594 | -11.197 | 15.574 | 292.373 | 293.252 |
| 96.16397471910112 | -11.426 | 14.15 | 294.606 | 295.397 |
| 96.33075842696628 | -11.724 | 12.832 | 297.91 | 298.631 |
| 96.49754213483145 | -11.918 | 12.463 | 302.885 | 303.57 |
| 96.66432584269663 | -12.041 | 12.674 | 309.494 | 310.162 |
| 96.8311095505618 | -12.041 | 12.656 | 315.137 | 315.805 |
| 96.99789325842697 | -11.971 | 12.674 | 319.338 | 319.988 |
| 97.16467696629213 | -11.654 | 12.709 | 322.467 | 323.099 |
| 97.3314606741573 | -11.197 | 12.498 | 323.961 | 324.576 |
| 97.49824438202248 | -10.898 | 12.639 | 325.683 | 326.263 |
| 97.66502808988764 | -10.582 | 12.849 | 327.248 | 327.828 |
| 97.8318117977528 | -10.213 | 13.201 | 328.461 | 329.058 |
| 97.99859550561798 | -9.896 | 13.781 | 328.162 | 328.777 |
| 98.16537921348316 | -9.58 | 13.763 | 326.808 | 327.406 |
| 98.33216292134833 | -9.123 | 14.713 | 325.226 | 325.877 |
| 98.49894662921349 | -8.719 | 15.574 | 322.677 | 323.363 |
| 98.66573033707866 | -8.437 | 15.732 | 320.129 | 320.832 |
| 98.8325140449438 | -8.191 | 15.574 | 320.058 | 320.761 |
| 98.99929775280897 | -7.822 | 15.539 | 320.849 | 321.57 |
| 99.16608146067416 | -7.154 | 16.435 | 323.609 | 324.418 |
| 99.33286516853933 | -6.574 | 17.191 | 326.826 | 327.687 |
| 99.49964887640449 | -6.064 | 18.176 | 327.529 | 328.461 |
| 99.66643258426966 | -5.678 | 19.494 | 325.595 | 326.597 |
| 99.83321629213484 | -5.414 | 20.531 | 323.609 | 324.664 |
| 100.0 | -4.887 | 21.761 | 322.783 | 323.978 |